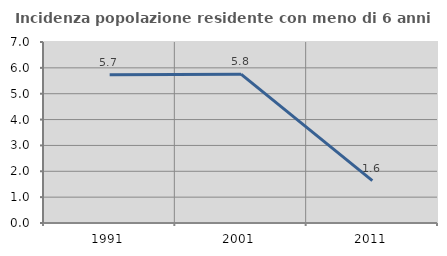
| Category | Incidenza popolazione residente con meno di 6 anni |
|---|---|
| 1991.0 | 5.738 |
| 2001.0 | 5.755 |
| 2011.0 | 1.639 |